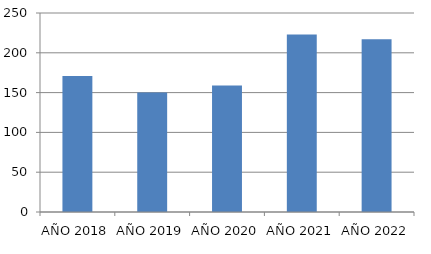
| Category | Series 0 |
|---|---|
| AÑO 2018 | 171 |
| AÑO 2019 | 150 |
| AÑO 2020 | 159 |
| AÑO 2021 | 223 |
| AÑO 2022 | 217 |